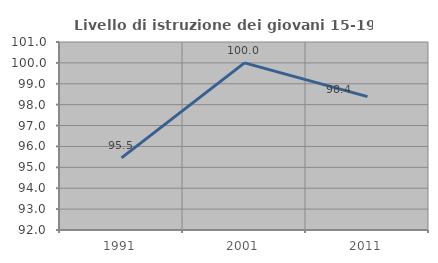
| Category | Livello di istruzione dei giovani 15-19 anni |
|---|---|
| 1991.0 | 95.455 |
| 2001.0 | 100 |
| 2011.0 | 98.387 |